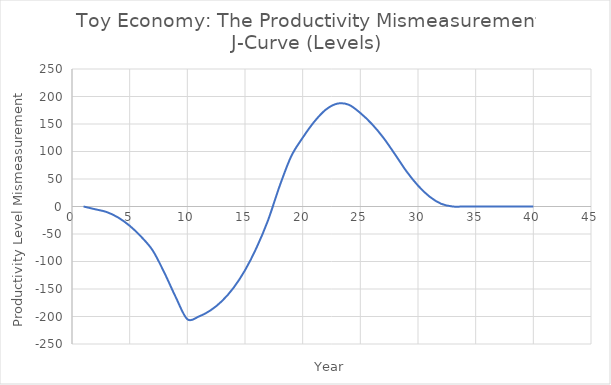
| Category | LevelsJCurve |
|---|---|
| 1.0 | 0 |
| 2.0 | -5 |
| 3.0 | -10 |
| 4.0 | -20 |
| 5.0 | -35 |
| 6.0 | -55 |
| 7.0 | -80 |
| 8.0 | -120 |
| 9.0 | -165 |
| 10.0 | -205 |
| 11.0 | -200 |
| 12.0 | -189 |
| 13.0 | -172 |
| 14.0 | -148 |
| 15.0 | -116 |
| 16.0 | -75 |
| 17.0 | -25 |
| 18.0 | 37 |
| 19.0 | 91 |
| 20.0 | 125 |
| 21.0 | 154 |
| 22.0 | 176 |
| 23.0 | 187 |
| 24.0 | 185 |
| 25.0 | 170 |
| 26.0 | 150 |
| 27.0 | 125 |
| 28.0 | 95 |
| 29.0 | 64 |
| 30.0 | 38 |
| 31.0 | 18 |
| 32.0 | 5 |
| 33.0 | 0 |
| 34.0 | 0 |
| 35.0 | 0 |
| 36.0 | 0 |
| 37.0 | 0 |
| 38.0 | 0 |
| 39.0 | 0 |
| 40.0 | 0 |